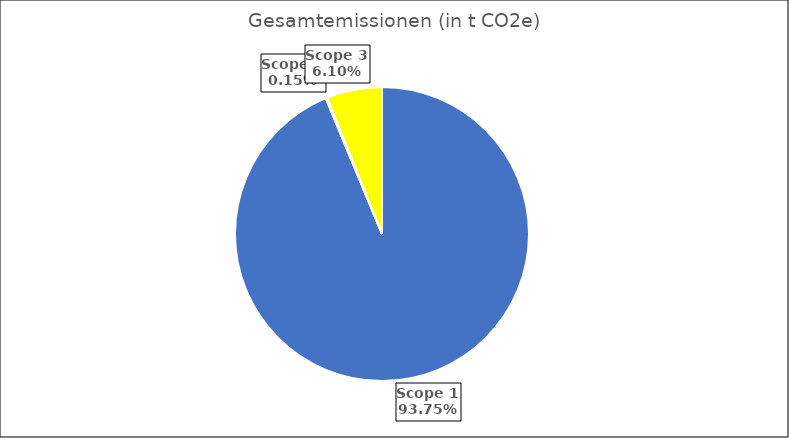
| Category | Gesamtemissionen (in t CO2e) |
|---|---|
| Scope 1 | 836.209 |
| Scope 2 | 1.327 |
| Scope 3 | 54.442 |